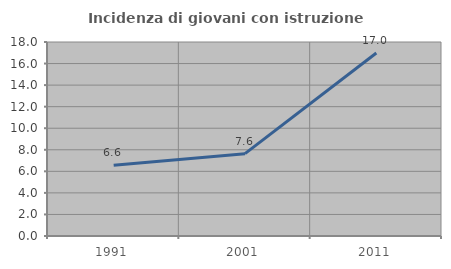
| Category | Incidenza di giovani con istruzione universitaria |
|---|---|
| 1991.0 | 6.557 |
| 2001.0 | 7.639 |
| 2011.0 | 16.981 |